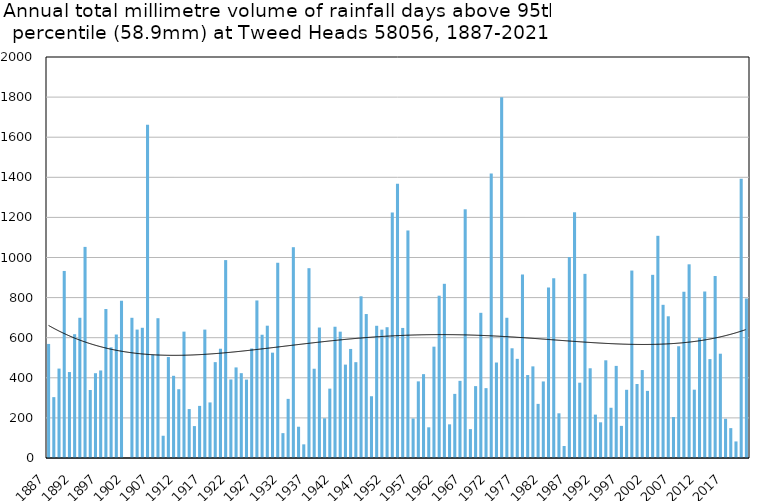
| Category | Annual total mm in days above 95th percentile |
|---|---|
| 1887 | 568.9 |
| 1888 | 303.6 |
| 1889 | 446 |
| 1890 | 932.9 |
| 1891 | 428.7 |
| 1892 | 617.4 |
| 1893 | 699.4 |
| 1894 | 1052.9 |
| 1895 | 339.3 |
| 1896 | 422.9 |
| 1897 | 436.6 |
| 1898 | 743 |
| 1899 | 551.9 |
| 1900 | 615.9 |
| 1901 | 784.9 |
| 1902 | 0 |
| 1903 | 699.3 |
| 1904 | 640.5 |
| 1905 | 649.5 |
| 1906 | 1661.7 |
| 1907 | 515.4 |
| 1908 | 697.2 |
| 1909 | 111 |
| 1910 | 503.6 |
| 1911 | 410 |
| 1912 | 343 |
| 1913 | 630.3 |
| 1914 | 244.1 |
| 1915 | 159.2 |
| 1916 | 259.9 |
| 1917 | 640.4 |
| 1918 | 277.2 |
| 1919 | 478.1 |
| 1920 | 545 |
| 1921 | 987 |
| 1922 | 391.7 |
| 1923 | 451.8 |
| 1924 | 423.1 |
| 1925 | 391.1 |
| 1926 | 546.1 |
| 1927 | 785.7 |
| 1928 | 614.8 |
| 1929 | 659.9 |
| 1930 | 525.4 |
| 1931 | 973.8 |
| 1932 | 124 |
| 1933 | 294.9 |
| 1934 | 1051.4 |
| 1935 | 156 |
| 1936 | 68.1 |
| 1937 | 946.7 |
| 1938 | 445.2 |
| 1939 | 650.8 |
| 1940 | 198.1 |
| 1941 | 346 |
| 1942 | 654.7 |
| 1943 | 630.1 |
| 1944 | 465.8 |
| 1945 | 543.9 |
| 1946 | 478 |
| 1947 | 806.5 |
| 1948 | 718 |
| 1949 | 308 |
| 1950 | 659.4 |
| 1951 | 640.1 |
| 1952 | 652.3 |
| 1953 | 1224.5 |
| 1954 | 1367.3 |
| 1955 | 648.7 |
| 1956 | 1134.8 |
| 1957 | 197.2 |
| 1958 | 382.2 |
| 1959 | 418.2 |
| 1960 | 153.1 |
| 1961 | 555.3 |
| 1962 | 809.5 |
| 1963 | 868.8 |
| 1964 | 167.9 |
| 1965 | 319.8 |
| 1966 | 384.8 |
| 1967 | 1240.4 |
| 1968 | 144 |
| 1969 | 358.5 |
| 1970 | 724.1 |
| 1971 | 348.4 |
| 1972 | 1419.4 |
| 1973 | 476.2 |
| 1974 | 1798.9 |
| 1975 | 699.4 |
| 1976 | 547.2 |
| 1977 | 494.6 |
| 1978 | 914.8 |
| 1979 | 413.8 |
| 1980 | 457 |
| 1981 | 270 |
| 1982 | 381.8 |
| 1983 | 850.4 |
| 1984 | 896.5 |
| 1985 | 222.9 |
| 1986 | 60 |
| 1987 | 1002.2 |
| 1988 | 1225.6 |
| 1989 | 375.6 |
| 1990 | 918.4 |
| 1991 | 447.5 |
| 1992 | 216.4 |
| 1993 | 178 |
| 1994 | 487.2 |
| 1995 | 250.6 |
| 1996 | 459.4 |
| 1997 | 160.2 |
| 1998 | 340.2 |
| 1999 | 934.9 |
| 2000 | 369.2 |
| 2001 | 438.6 |
| 2002 | 334.8 |
| 2003 | 913.6 |
| 2004 | 1108.2 |
| 2005 | 764 |
| 2006 | 706.8 |
| 2007 | 204.2 |
| 2008 | 557.4 |
| 2009 | 829.2 |
| 2010 | 966 |
| 2011 | 340.8 |
| 2012 | 599.4 |
| 2013 | 830.4 |
| 2014 | 493.2 |
| 2015 | 907.6 |
| 2016 | 520.2 |
| 2017 | 195.6 |
| 2018 | 149 |
| 2019 | 82.6 |
| 2020 | 1392.6 |
| 2021 | 795.4 |